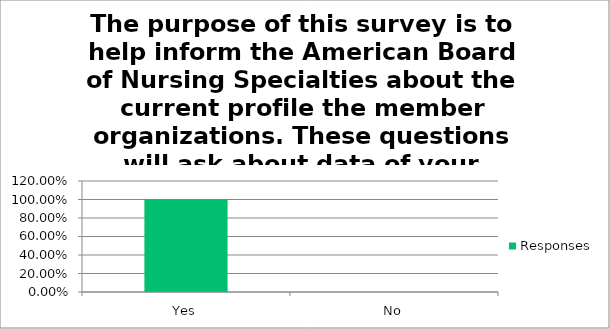
| Category | Responses |
|---|---|
| Yes | 1 |
| No | 0 |